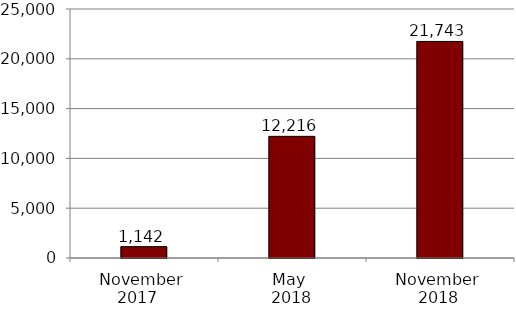
| Category | Series 0 |
|---|---|
| November | 1142 |
| May | 12216 |
| November | 21743 |